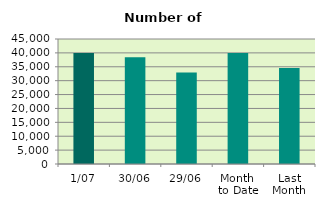
| Category | Series 0 |
|---|---|
| 1/07 | 39990 |
| 30/06 | 38398 |
| 29/06 | 32968 |
| Month 
to Date | 39990 |
| Last
Month | 34545 |